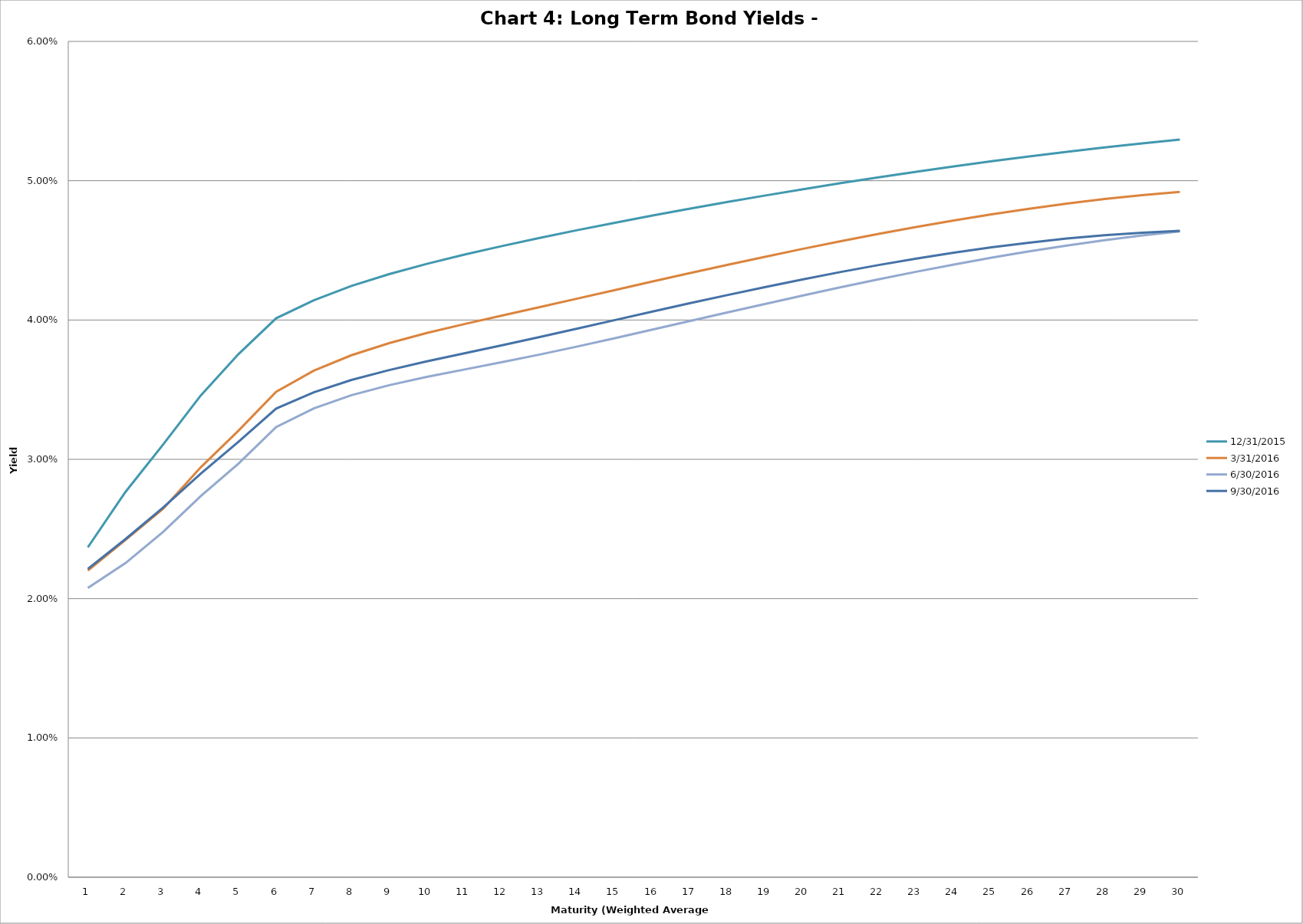
| Category | 12/31/2015 | 3/31/2016 | 6/30/2016 | 9/30/2016 |
|---|---|---|---|---|
| 0 | 0.024 | 0.022 | 0.021 | 0.022 |
| 1 | 0.028 | 0.024 | 0.023 | 0.024 |
| 2 | 0.031 | 0.026 | 0.025 | 0.027 |
| 3 | 0.035 | 0.029 | 0.027 | 0.029 |
| 4 | 0.038 | 0.032 | 0.03 | 0.031 |
| 5 | 0.04 | 0.035 | 0.032 | 0.034 |
| 6 | 0.041 | 0.036 | 0.034 | 0.035 |
| 7 | 0.042 | 0.037 | 0.035 | 0.036 |
| 8 | 0.043 | 0.038 | 0.035 | 0.036 |
| 9 | 0.044 | 0.039 | 0.036 | 0.037 |
| 10 | 0.045 | 0.04 | 0.036 | 0.038 |
| 11 | 0.045 | 0.04 | 0.037 | 0.038 |
| 12 | 0.046 | 0.041 | 0.038 | 0.039 |
| 13 | 0.046 | 0.042 | 0.038 | 0.039 |
| 14 | 0.047 | 0.042 | 0.039 | 0.04 |
| 15 | 0.048 | 0.043 | 0.039 | 0.041 |
| 16 | 0.048 | 0.043 | 0.04 | 0.041 |
| 17 | 0.048 | 0.044 | 0.041 | 0.042 |
| 18 | 0.049 | 0.045 | 0.041 | 0.042 |
| 19 | 0.049 | 0.045 | 0.042 | 0.043 |
| 20 | 0.05 | 0.046 | 0.042 | 0.043 |
| 21 | 0.05 | 0.046 | 0.043 | 0.044 |
| 22 | 0.051 | 0.047 | 0.043 | 0.044 |
| 23 | 0.051 | 0.047 | 0.044 | 0.045 |
| 24 | 0.051 | 0.048 | 0.044 | 0.045 |
| 25 | 0.052 | 0.048 | 0.045 | 0.046 |
| 26 | 0.052 | 0.048 | 0.045 | 0.046 |
| 27 | 0.052 | 0.049 | 0.046 | 0.046 |
| 28 | 0.053 | 0.049 | 0.046 | 0.046 |
| 29 | 0.053 | 0.049 | 0.046 | 0.046 |